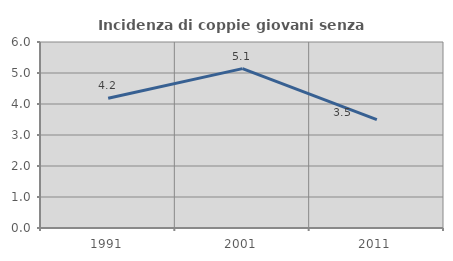
| Category | Incidenza di coppie giovani senza figli |
|---|---|
| 1991.0 | 4.188 |
| 2001.0 | 5.141 |
| 2011.0 | 3.498 |